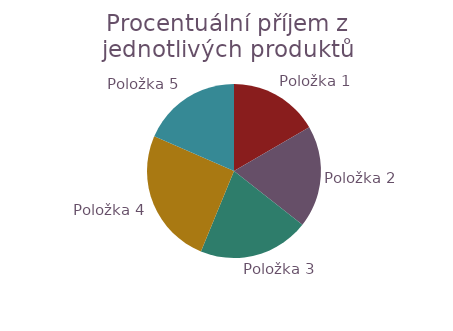
| Category | Celkový 
příjem |
|---|---|
| Položka 1 | 196.75 |
| Položka 2 | 224.625 |
| Položka 3 | 244 |
| Položka 4 | 300 |
| Položka 5 | 218.4 |